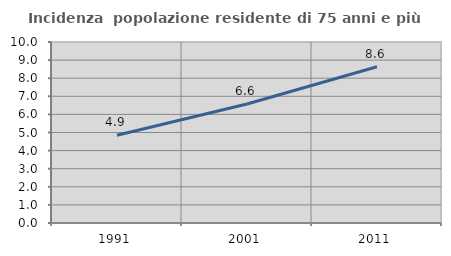
| Category | Incidenza  popolazione residente di 75 anni e più |
|---|---|
| 1991.0 | 4.852 |
| 2001.0 | 6.577 |
| 2011.0 | 8.633 |